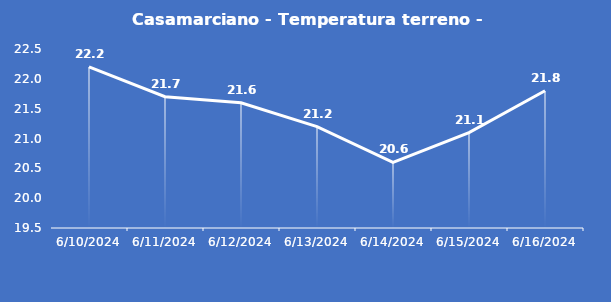
| Category | Casamarciano - Temperatura terreno - Grezzo (°C) |
|---|---|
| 6/10/24 | 22.2 |
| 6/11/24 | 21.7 |
| 6/12/24 | 21.6 |
| 6/13/24 | 21.2 |
| 6/14/24 | 20.6 |
| 6/15/24 | 21.1 |
| 6/16/24 | 21.8 |